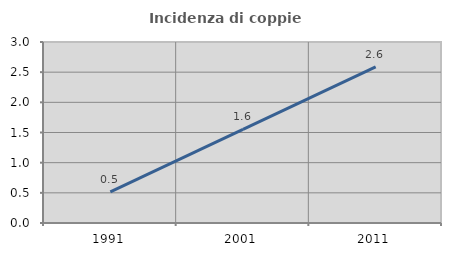
| Category | Incidenza di coppie miste |
|---|---|
| 1991.0 | 0.515 |
| 2001.0 | 1.551 |
| 2011.0 | 2.589 |